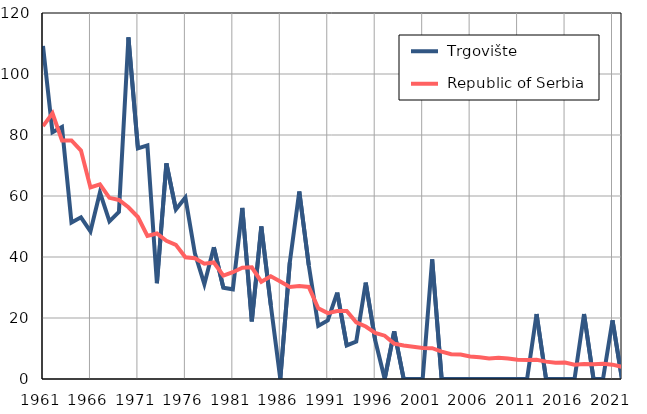
| Category |  Trgovište |  Republic of Serbia |
|---|---|---|
| 1961.0 | 109.2 | 82.9 |
| 1962.0 | 80.9 | 87.1 |
| 1963.0 | 82.6 | 78.2 |
| 1964.0 | 51.3 | 78.2 |
| 1965.0 | 53 | 74.9 |
| 1966.0 | 48.4 | 62.8 |
| 1967.0 | 61.2 | 63.8 |
| 1968.0 | 51.7 | 59.4 |
| 1969.0 | 54.8 | 58.7 |
| 1970.0 | 112 | 56.3 |
| 1971.0 | 75.6 | 53.1 |
| 1972.0 | 76.6 | 46.9 |
| 1973.0 | 31.4 | 47.7 |
| 1974.0 | 70.7 | 45.3 |
| 1975.0 | 55.6 | 44 |
| 1976.0 | 59.5 | 39.9 |
| 1977.0 | 41.2 | 39.6 |
| 1978.0 | 31.1 | 37.8 |
| 1979.0 | 43.2 | 38.2 |
| 1980.0 | 29.9 | 33.9 |
| 1981.0 | 29.4 | 35 |
| 1982.0 | 56.1 | 36.5 |
| 1983.0 | 18.9 | 36.6 |
| 1984.0 | 50 | 31.9 |
| 1985.0 | 24.2 | 33.7 |
| 1986.0 | 0 | 32 |
| 1987.0 | 38.2 | 30.2 |
| 1988.0 | 61.5 | 30.5 |
| 1989.0 | 37.3 | 30.2 |
| 1990.0 | 17.4 | 23.2 |
| 1991.0 | 19.2 | 21.6 |
| 1992.0 | 28.3 | 22.3 |
| 1993.0 | 11 | 22.3 |
| 1994.0 | 12.3 | 18.6 |
| 1995.0 | 31.6 | 17.2 |
| 1996.0 | 12.7 | 15.1 |
| 1997.0 | 0 | 14.2 |
| 1998.0 | 15.6 | 11.6 |
| 1999.0 | 0 | 11 |
| 2000.0 | 0 | 10.6 |
| 2001.0 | 0 | 10.2 |
| 2002.0 | 39.2 | 10.1 |
| 2003.0 | 0 | 9 |
| 2004.0 | 0 | 8.1 |
| 2005.0 | 0 | 8 |
| 2006.0 | 0 | 7.4 |
| 2007.0 | 0 | 7.1 |
| 2008.0 | 0 | 6.7 |
| 2009.0 | 0 | 7 |
| 2010.0 | 0 | 6.7 |
| 2011.0 | 0 | 6.3 |
| 2012.0 | 0 | 6.2 |
| 2013.0 | 21.3 | 6.3 |
| 2014.0 | 0 | 5.7 |
| 2015.0 | 0 | 5.3 |
| 2016.0 | 0 | 5.4 |
| 2017.0 | 0 | 4.7 |
| 2018.0 | 21.3 | 4.9 |
| 2019.0 | 0 | 4.8 |
| 2020.0 | 0 | 5 |
| 2021.0 | 19.2 | 4.7 |
| 2022.0 | 0 | 4 |